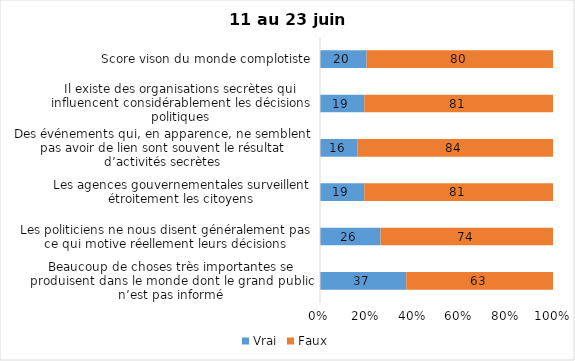
| Category | Vrai | Faux |
|---|---|---|
| Beaucoup de choses très importantes se produisent dans le monde dont le grand public n’est pas informé | 37 | 63 |
| Les politiciens ne nous disent généralement pas ce qui motive réellement leurs décisions | 26 | 74 |
| Les agences gouvernementales surveillent étroitement les citoyens | 19 | 81 |
| Des événements qui, en apparence, ne semblent pas avoir de lien sont souvent le résultat d’activités secrètes | 16 | 84 |
| Il existe des organisations secrètes qui influencent considérablement les décisions politiques | 19 | 81 |
| Score vison du monde complotiste | 20 | 80 |